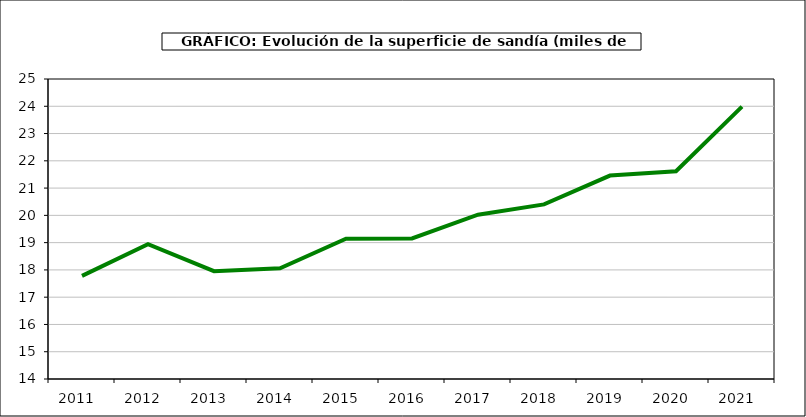
| Category | superficie |
|---|---|
| 2011.0 | 17.783 |
| 2012.0 | 18.942 |
| 2013.0 | 17.953 |
| 2014.0 | 18.059 |
| 2015.0 | 19.147 |
| 2016.0 | 19.156 |
| 2017.0 | 20.026 |
| 2018.0 | 20.401 |
| 2019.0 | 21.459 |
| 2020.0 | 21.617 |
| 2021.0 | 23.986 |